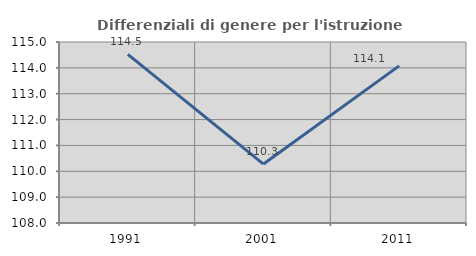
| Category | Differenziali di genere per l'istruzione superiore |
|---|---|
| 1991.0 | 114.521 |
| 2001.0 | 110.279 |
| 2011.0 | 114.077 |